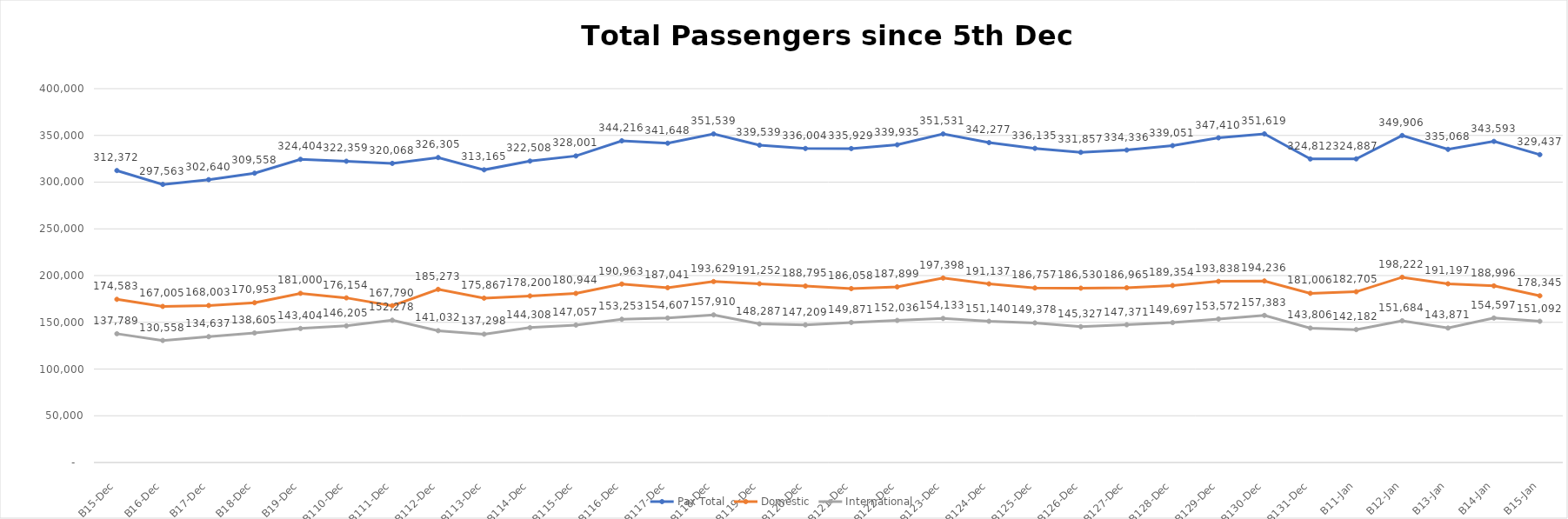
| Category | Pax Total |  Domestic  |  International  |
|---|---|---|---|
| 2022-12-05 | 312372 | 174583 | 137789 |
| 2022-12-06 | 297563 | 167005 | 130558 |
| 2022-12-07 | 302640 | 168003 | 134637 |
| 2022-12-08 | 309558 | 170953 | 138605 |
| 2022-12-09 | 324404 | 181000 | 143404 |
| 2022-12-10 | 322359 | 176154 | 146205 |
| 2022-12-11 | 320068 | 167790 | 152278 |
| 2022-12-12 | 326305 | 185273 | 141032 |
| 2022-12-13 | 313165 | 175867 | 137298 |
| 2022-12-14 | 322508 | 178200 | 144308 |
| 2022-12-15 | 328001 | 180944 | 147057 |
| 2022-12-16 | 344216 | 190963 | 153253 |
| 2022-12-17 | 341648 | 187041 | 154607 |
| 2022-12-18 | 351539 | 193629 | 157910 |
| 2022-12-19 | 339539 | 191252 | 148287 |
| 2022-12-20 | 336004 | 188795 | 147209 |
| 2022-12-21 | 335929 | 186058 | 149871 |
| 2022-12-22 | 339935 | 187899 | 152036 |
| 2022-12-23 | 351531 | 197398 | 154133 |
| 2022-12-24 | 342277 | 191137 | 151140 |
| 2022-12-25 | 336135 | 186757 | 149378 |
| 2022-12-26 | 331857 | 186530 | 145327 |
| 2022-12-27 | 334336 | 186965 | 147371 |
| 2022-12-28 | 339051 | 189354 | 149697 |
| 2022-12-29 | 347410 | 193838 | 153572 |
| 2022-12-30 | 351619 | 194236 | 157383 |
| 2022-12-31 | 324812 | 181006 | 143806 |
| 2023-01-01 | 324887 | 182705 | 142182 |
| 2023-01-02 | 349906 | 198222 | 151684 |
| 2023-01-03 | 335068 | 191197 | 143871 |
| 2023-01-04 | 343593 | 188996 | 154597 |
| 2023-01-05 | 329437 | 178345 | 151092 |